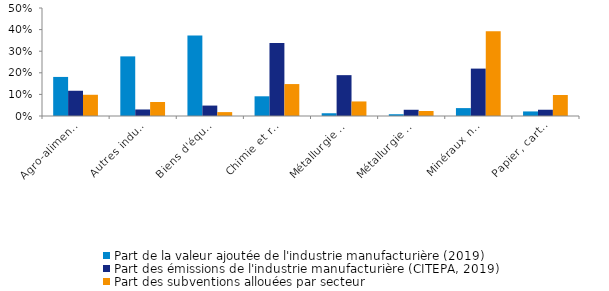
| Category | Part de la valeur ajoutée de l'industrie manufacturière (2019) | Part des émissions de l'industrie manufacturière (CITEPA, 2019) | Part des subventions allouées par secteur |
|---|---|---|---|
| Agro-alimentaire | 0.181 | 0.117 | 0.098 |
| Autres industries manufacturières | 0.276 | 0.03 | 0.065 |
| Biens d'équipements, matériels de transport | 0.373 | 0.048 | 0.018 |
| Chimie et raffinage du pétrole | 0.091 | 0.338 | 0.148 |
| Métallurgie des métaux ferreux | 0.013 | 0.189 | 0.067 |
| Métallurgie des métaux non ferreux | 0.008 | 0.029 | 0.023 |
| Minéraux non métalliques, matériaux de construction | 0.037 | 0.219 | 0.392 |
| Papier, carton | 0.021 | 0.029 | 0.097 |